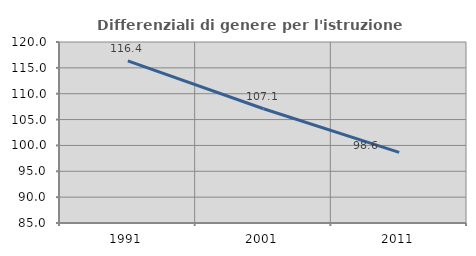
| Category | Differenziali di genere per l'istruzione superiore |
|---|---|
| 1991.0 | 116.367 |
| 2001.0 | 107.088 |
| 2011.0 | 98.645 |